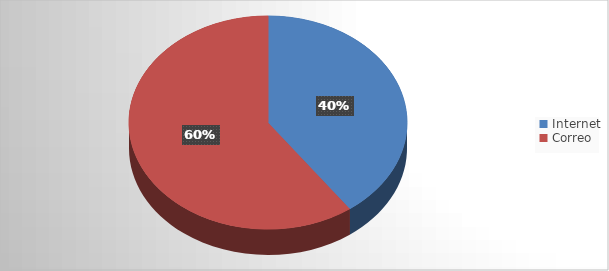
| Category | Series 0 |
|---|---|
| Internet | 6 |
| Correo | 9 |